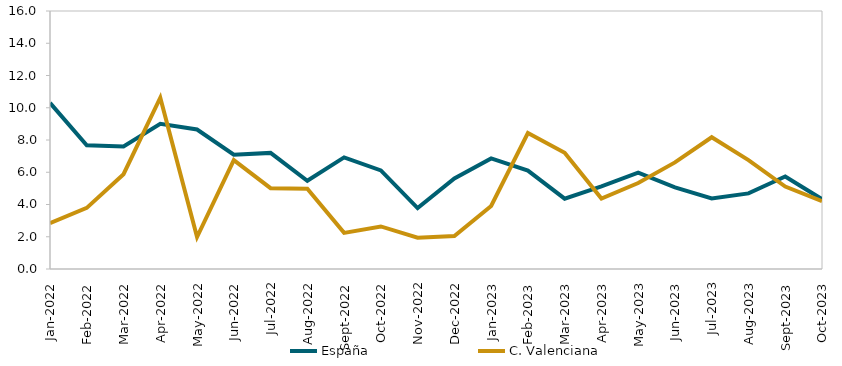
| Category | España | C. Valenciana |
|---|---|---|
| 2022-01-01 | 10.3 | 2.85 |
| 2022-02-01 | 7.67 | 3.79 |
| 2022-03-01 | 7.6 | 5.88 |
| 2022-04-01 | 9 | 10.62 |
| 2022-05-01 | 8.65 | 1.98 |
| 2022-06-01 | 7.09 | 6.75 |
| 2022-07-01 | 7.2 | 5.01 |
| 2022-08-01 | 5.47 | 4.98 |
| 2022-09-01 | 6.92 | 2.24 |
| 2022-10-01 | 6.11 | 2.64 |
| 2022-11-01 | 3.78 | 1.94 |
| 2022-12-01 | 5.61 | 2.05 |
| 2023-01-01 | 6.86 | 3.91 |
| 2023-02-01 | 6.1 | 8.43 |
| 2023-03-01 | 4.36 | 7.21 |
| 2023-04-01 | 5.13 | 4.37 |
| 2023-05-01 | 5.97 | 5.33 |
| 2023-06-01 | 5.06 | 6.61 |
| 2023-07-01 | 4.37 | 8.17 |
| 2023-08-01 | 4.69 | 6.75 |
| 2023-09-01 | 5.74 | 5.11 |
| 2023-10-01 | 4.33 | 4.21 |